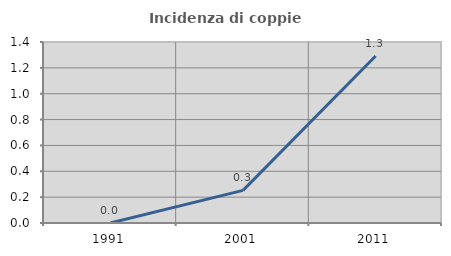
| Category | Incidenza di coppie miste |
|---|---|
| 1991.0 | 0 |
| 2001.0 | 0.253 |
| 2011.0 | 1.292 |